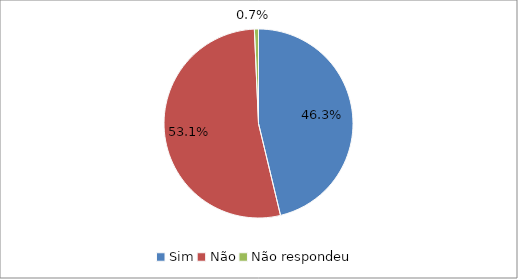
| Category | Series 0 |
|---|---|
| Sim | 0.463 |
| Não | 0.531 |
| Não respondeu | 0.007 |